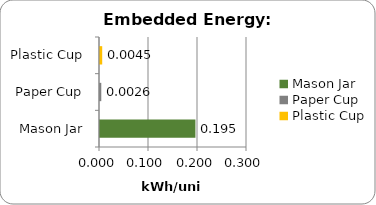
| Category | Series 0 |
|---|---|
| Mason Jar | 0.195 |
| Paper Cup | 0.003 |
| Plastic Cup | 0.005 |